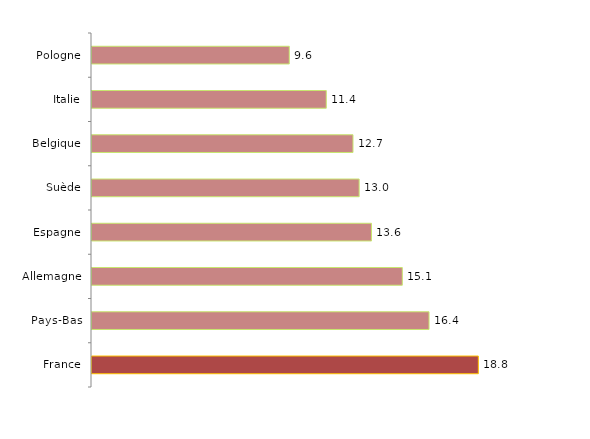
| Category | Series 0 |
|---|---|
| France | 18.8 |
| Pays-Bas | 16.4 |
| Allemagne | 15.1 |
| Espagne | 13.6 |
| Suède | 13 |
| Belgique | 12.7 |
| Italie | 11.4 |
| Pologne | 9.6 |